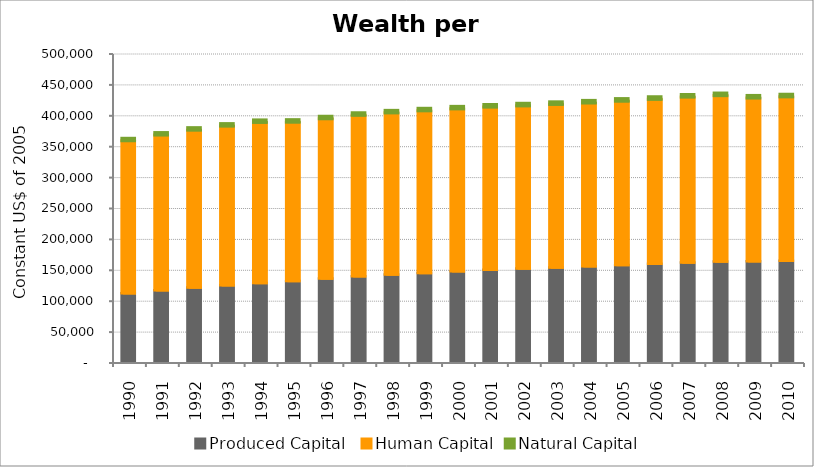
| Category | Produced Capital  | Human Capital | Natural Capital |
|---|---|---|---|
| 1990.0 | 111001.898 | 246951.476 | 3280.577 |
| 1991.0 | 115765.507 | 251454.084 | 3267.562 |
| 1992.0 | 120052.769 | 255112.87 | 3254.1 |
| 1993.0 | 123866.923 | 257849.832 | 3240.084 |
| 1994.0 | 127378.957 | 260301.177 | 3227.187 |
| 1995.0 | 130846.086 | 257253.823 | 3199.377 |
| 1996.0 | 134610.506 | 258995.162 | 3188.767 |
| 1997.0 | 138224.914 | 261037.35 | 3179.594 |
| 1998.0 | 141047.49 | 262095.66 | 3171.979 |
| 1999.0 | 143700.906 | 262785.457 | 3166.754 |
| 2000.0 | 146349.341 | 263262.568 | 3170.64 |
| 2001.0 | 148815.858 | 263818.969 | 3028.148 |
| 2002.0 | 150772.46 | 263832.281 | 3030.74 |
| 2003.0 | 152618.113 | 264332.495 | 3035.075 |
| 2004.0 | 154520.712 | 264746.488 | 3041.375 |
| 2005.0 | 156620.505 | 265573.715 | 3048.403 |
| 2006.0 | 158695.166 | 266485.866 | 3038.365 |
| 2007.0 | 160610.812 | 268211.613 | 3028.733 |
| 2008.0 | 162173.643 | 269014.736 | 3019.33 |
| 2009.0 | 162759.199 | 264530.008 | 3011.557 |
| 2010.0 | 163337.337 | 265892.835 | 3005.355 |